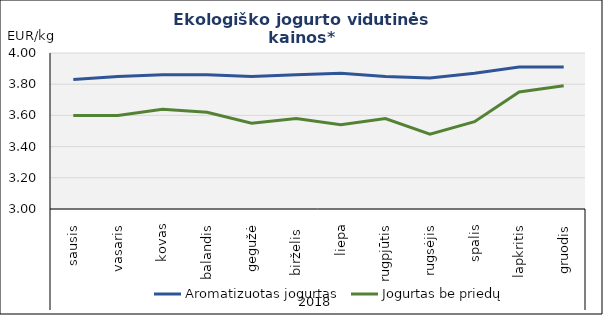
| Category | Aromatizuotas jogurtas | Jogurtas be priedų |
|---|---|---|
| 0 | 3.83 | 3.6 |
| 1 | 3.85 | 3.6 |
| 2 | 3.86 | 3.64 |
| 3 | 3.86 | 3.62 |
| 4 | 3.85 | 3.55 |
| 5 | 3.86 | 3.58 |
| 6 | 3.87 | 3.54 |
| 7 | 3.85 | 3.58 |
| 8 | 3.84 | 3.48 |
| 9 | 3.87 | 3.56 |
| 10 | 3.91 | 3.75 |
| 11 | 3.91 | 3.79 |